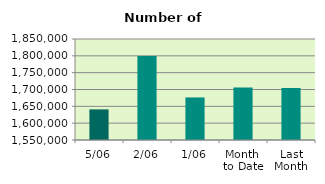
| Category | Series 0 |
|---|---|
| 5/06 | 1640900 |
| 2/06 | 1799440 |
| 1/06 | 1676414 |
| Month 
to Date | 1705584.667 |
| Last
Month | 1704183.636 |